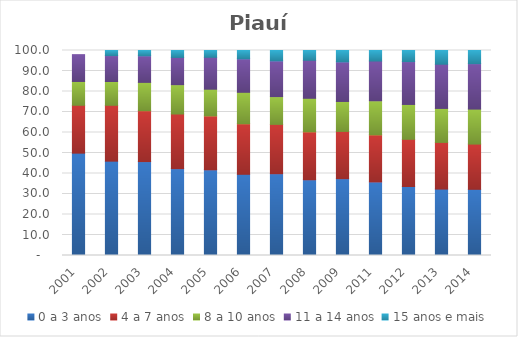
| Category | 0 a 3 anos | 4 a 7 anos | 8 a 10 anos | 11 a 14 anos | 15 anos e mais |
|---|---|---|---|---|---|
| 2001.0 | 49.93 | 23.35 | 11.62 | 13.08 | 0 |
| 2002.0 | 46.02 | 27.25 | 11.62 | 12.63 | 2.49 |
| 2003.0 | 45.81 | 24.82 | 13.82 | 12.97 | 2.57 |
| 2004.0 | 42.38 | 26.64 | 14.31 | 13.29 | 3.39 |
| 2005.0 | 41.8 | 26.29 | 13.03 | 15.57 | 3.31 |
| 2006.0 | 39.61 | 24.64 | 15.36 | 16.34 | 4.05 |
| 2007.0 | 39.9 | 24.06 | 13.55 | 17.45 | 5.05 |
| 2008.0 | 36.94 | 23.38 | 16.37 | 18.55 | 4.76 |
| 2009.0 | 37.49 | 23.04 | 14.61 | 19.33 | 5.52 |
| 2011.0 | 35.89 | 22.96 | 16.61 | 19.41 | 5.13 |
| 2012.0 | 33.66 | 23.02 | 17.01 | 20.9 | 5.42 |
| 2013.0 | 32.4 | 22.77 | 16.57 | 21.57 | 6.69 |
| 2014.0 | 32.28 | 22.07 | 17.06 | 22.18 | 6.41 |